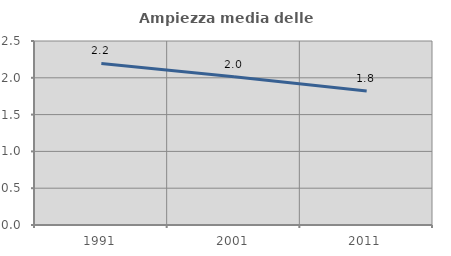
| Category | Ampiezza media delle famiglie |
|---|---|
| 1991.0 | 2.195 |
| 2001.0 | 2.015 |
| 2011.0 | 1.82 |